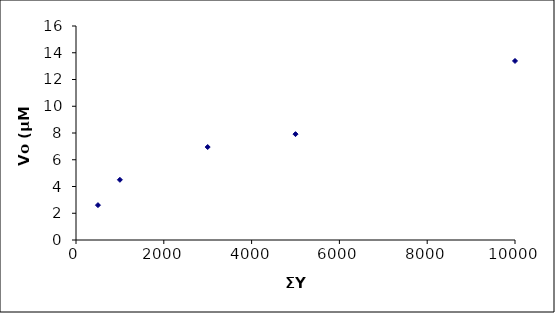
| Category | Vo (μΜ/min) |
|---|---|
| 500.0 | 2.607 |
| 1000.0 | 4.5 |
| 3000.0 | 6.95 |
| 5000.0 | 7.914 |
| 10000.0 | 13.386 |